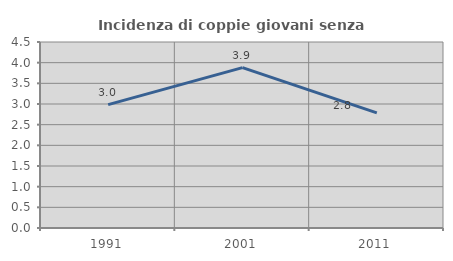
| Category | Incidenza di coppie giovani senza figli |
|---|---|
| 1991.0 | 2.986 |
| 2001.0 | 3.88 |
| 2011.0 | 2.786 |